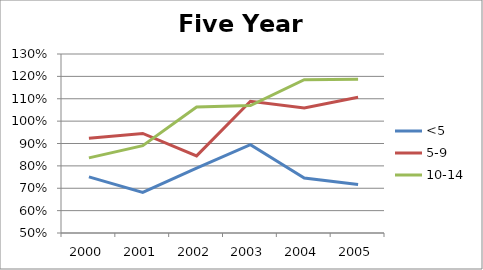
| Category | <5 | 5-9 | 10-14 |
|---|---|---|---|
| 2000.0 | 0.751 | 0.924 | 0.836 |
| 2001.0 | 0.682 | 0.945 | 0.891 |
| 2002.0 | 0.79 | 0.844 | 1.063 |
| 2003.0 | 0.895 | 1.089 | 1.07 |
| 2004.0 | 0.746 | 1.058 | 1.185 |
| 2005.0 | 0.717 | 1.107 | 1.187 |